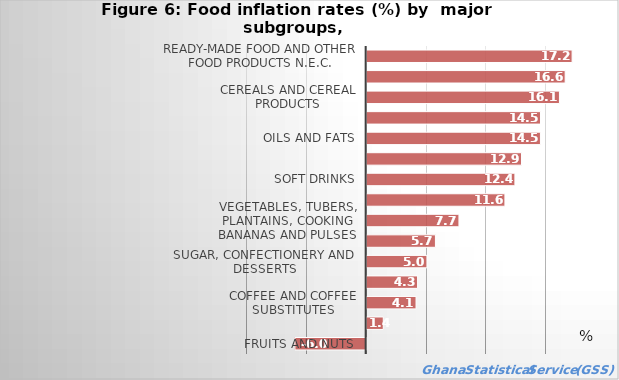
| Category | Series 0 |
|---|---|
| Fruits and nuts | -5.953 |
| Water | 1.388 |
| Coffee and coffee substitutes | 4.125 |
| Fruit and vegetable juices | 4.255 |
| Sugar, confectionery and desserts | 5.034 |
| Fish and other seafood | 5.746 |
| Vegetables, tubers, plantains, cooking bananas and pulses | 7.712 |
| Live animals, meat and other parts of slaughtered land animals | 11.554 |
| Soft drinks | 12.388 |
| Tea, maté and other plant products for infusion | 12.938 |
| Oils and fats | 14.521 |
| Milk, other dairy products and eggs | 14.526 |
| Cereals and cereal products | 16.11 |
| Cocoa drinks | 16.587 |
| Ready-made food and other food products n.e.c. | 17.167 |